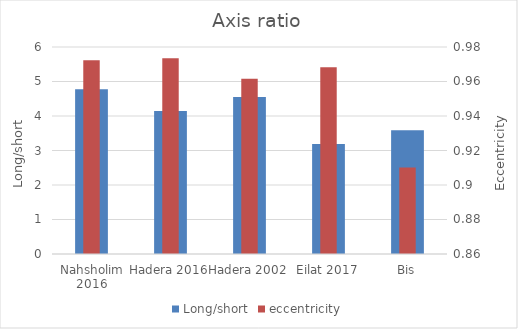
| Category | Long/short |
|---|---|
| Nahsholim 2016 | 4.778 |
| Hadera 2016 | 4.144 |
| Hadera 2002 | 4.553 |
| Eilat 2017 | 3.189 |
| Bis | 3.583 |